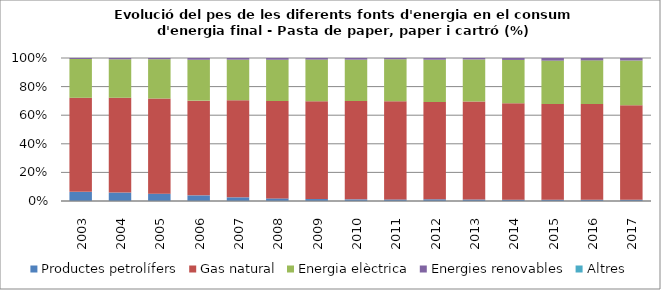
| Category | Productes petrolífers | Gas natural | Energia elèctrica | Energies renovables | Altres |
|---|---|---|---|---|---|
| 2003.0 | 25.8 | 265.8 | 109.5 | 2.9 | 0 |
| 2004.0 | 23.6 | 264.3 | 107.3 | 3.6 | 0 |
| 2005.0 | 20.3 | 262.1 | 108.2 | 3.4 | 0 |
| 2006.0 | 15.2 | 254.5 | 109.9 | 4.7 | 0 |
| 2007.0 | 10.4 | 274.4 | 114.7 | 4.7 | 0 |
| 2008.0 | 7 | 260.5 | 110.6 | 4.7 | 0 |
| 2009.0 | 4.7 | 234.2 | 99.4 | 3.8 | 0 |
| 2010.0 | 4 | 240.6 | 101.1 | 4 | 0 |
| 2011.0 | 3.9 | 242.9 | 103.4 | 3.2 | 0 |
| 2012.0 | 4.3 | 243.4 | 105.4 | 4.3 | 0 |
| 2013.0 | 3.7 | 239.8 | 102.8 | 3.6 | 0 |
| 2014.0 | 3 | 213.8 | 96 | 4.3 | 0 |
| 2015.0 | 2.9 | 213.1 | 96.5 | 5.8 | 0 |
| 2016.0 | 2.9 | 214.7 | 97.6 | 5.3 | 0 |
| 2017.0 | 2.8 | 209.7 | 99.3 | 5.5 | 0 |